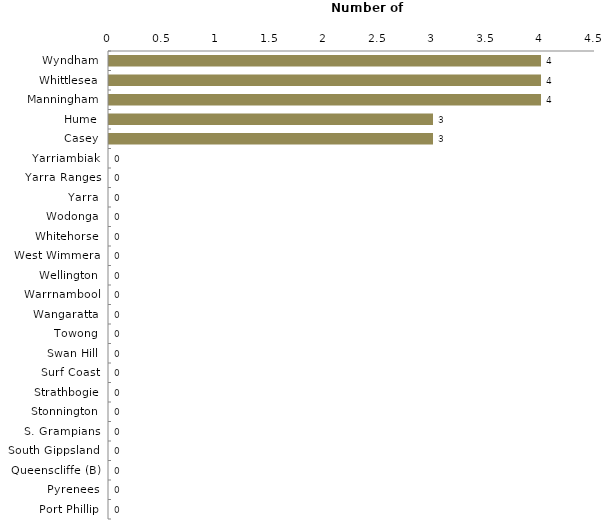
| Category | Series 0 |
|---|---|
| Wyndham | 4 |
| Whittlesea | 4 |
| Manningham | 4 |
| Hume | 3 |
| Casey | 3 |
| Yarriambiak | 0 |
| Yarra Ranges | 0 |
| Yarra | 0 |
| Wodonga | 0 |
| Whitehorse | 0 |
| West Wimmera | 0 |
| Wellington | 0 |
| Warrnambool | 0 |
| Wangaratta | 0 |
| Towong | 0 |
| Swan Hill | 0 |
| Surf Coast | 0 |
| Strathbogie | 0 |
| Stonnington | 0 |
| S. Grampians | 0 |
| South Gippsland | 0 |
| Queenscliffe (B) | 0 |
| Pyrenees | 0 |
| Port Phillip | 0 |